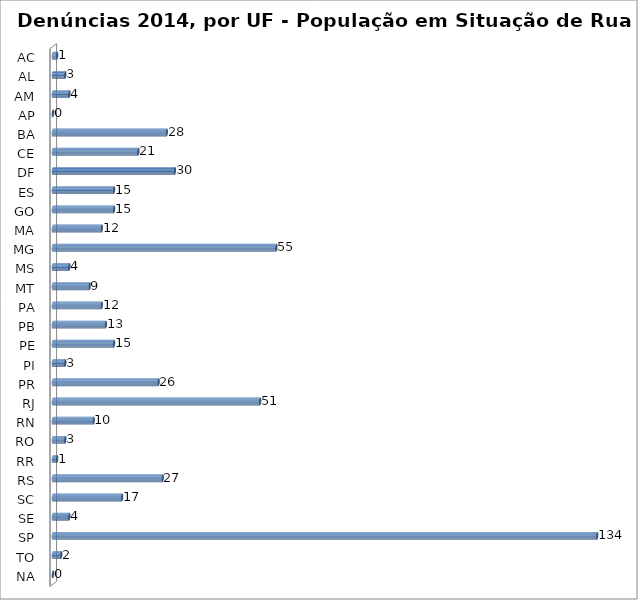
| Category | Series 0 |
|---|---|
| AC | 1 |
| AL | 3 |
| AM | 4 |
| AP | 0 |
| BA | 28 |
| CE | 21 |
| DF | 30 |
| ES | 15 |
| GO | 15 |
| MA | 12 |
| MG | 55 |
| MS | 4 |
| MT | 9 |
| PA | 12 |
| PB | 13 |
| PE | 15 |
| PI | 3 |
| PR | 26 |
| RJ | 51 |
| RN | 10 |
| RO | 3 |
| RR | 1 |
| RS | 27 |
| SC | 17 |
| SE | 4 |
| SP | 134 |
| TO | 2 |
| NA | 0 |